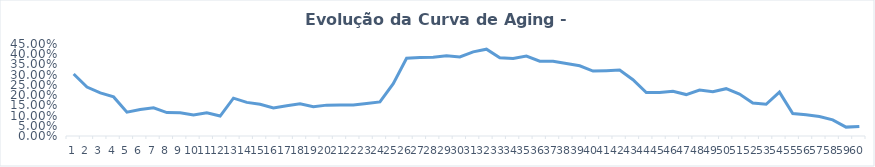
| Category | Público |
|---|---|
| 0 | 0.303 |
| 1 | 0.239 |
| 2 | 0.211 |
| 3 | 0.191 |
| 4 | 0.116 |
| 5 | 0.129 |
| 6 | 0.138 |
| 7 | 0.115 |
| 8 | 0.114 |
| 9 | 0.103 |
| 10 | 0.113 |
| 11 | 0.098 |
| 12 | 0.185 |
| 13 | 0.165 |
| 14 | 0.155 |
| 15 | 0.137 |
| 16 | 0.148 |
| 17 | 0.157 |
| 18 | 0.143 |
| 19 | 0.151 |
| 20 | 0.152 |
| 21 | 0.152 |
| 22 | 0.159 |
| 23 | 0.167 |
| 24 | 0.256 |
| 25 | 0.38 |
| 26 | 0.383 |
| 27 | 0.385 |
| 28 | 0.392 |
| 29 | 0.387 |
| 30 | 0.412 |
| 31 | 0.424 |
| 32 | 0.382 |
| 33 | 0.379 |
| 34 | 0.391 |
| 35 | 0.366 |
| 36 | 0.366 |
| 37 | 0.354 |
| 38 | 0.343 |
| 39 | 0.318 |
| 40 | 0.319 |
| 41 | 0.322 |
| 42 | 0.276 |
| 43 | 0.212 |
| 44 | 0.213 |
| 45 | 0.219 |
| 46 | 0.203 |
| 47 | 0.225 |
| 48 | 0.216 |
| 49 | 0.231 |
| 50 | 0.205 |
| 51 | 0.161 |
| 52 | 0.155 |
| 53 | 0.215 |
| 54 | 0.11 |
| 55 | 0.104 |
| 56 | 0.096 |
| 57 | 0.079 |
| 58 | 0.043 |
| 59 | 0.047 |